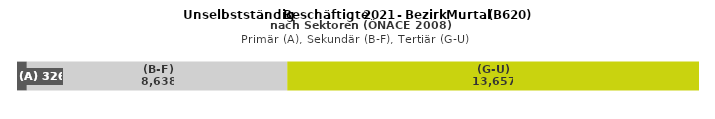
| Category | (A) | (B-F) | (G-U) |
|---|---|---|---|
| 0 | 326 | 8638 | 13657 |